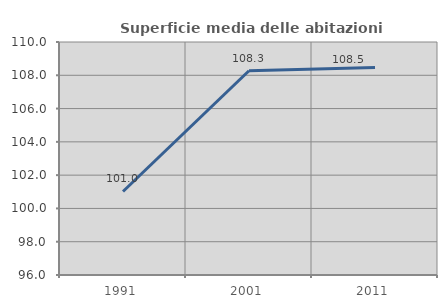
| Category | Superficie media delle abitazioni occupate |
|---|---|
| 1991.0 | 101.019 |
| 2001.0 | 108.272 |
| 2011.0 | 108.473 |